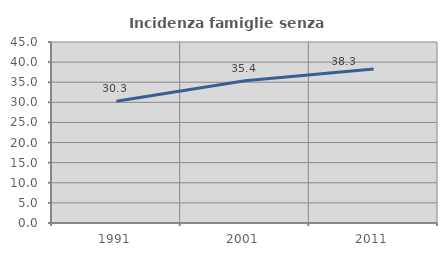
| Category | Incidenza famiglie senza nuclei |
|---|---|
| 1991.0 | 30.284 |
| 2001.0 | 35.38 |
| 2011.0 | 38.299 |